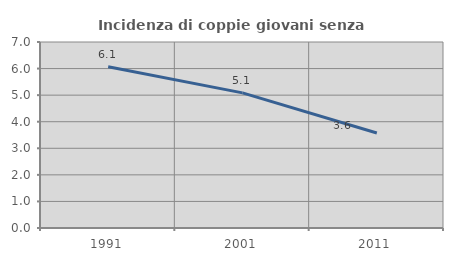
| Category | Incidenza di coppie giovani senza figli |
|---|---|
| 1991.0 | 6.072 |
| 2001.0 | 5.085 |
| 2011.0 | 3.577 |